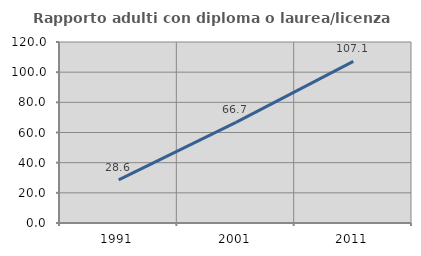
| Category | Rapporto adulti con diploma o laurea/licenza media  |
|---|---|
| 1991.0 | 28.571 |
| 2001.0 | 66.667 |
| 2011.0 | 107.143 |